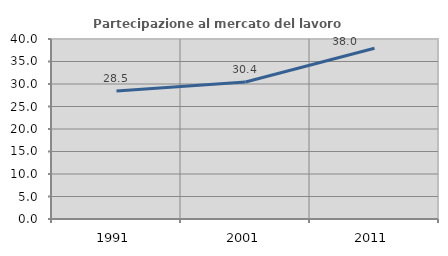
| Category | Partecipazione al mercato del lavoro  femminile |
|---|---|
| 1991.0 | 28.471 |
| 2001.0 | 30.443 |
| 2011.0 | 37.953 |